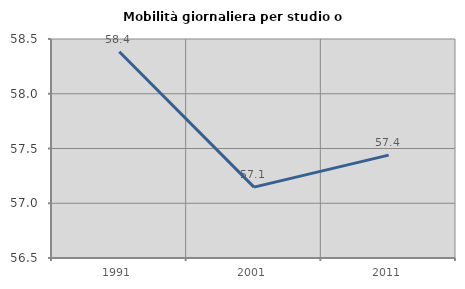
| Category | Mobilità giornaliera per studio o lavoro |
|---|---|
| 1991.0 | 58.383 |
| 2001.0 | 57.148 |
| 2011.0 | 57.44 |